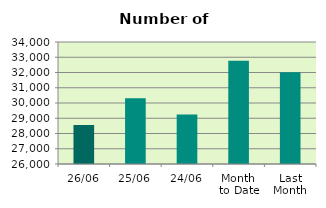
| Category | Series 0 |
|---|---|
| 26/06 | 28556 |
| 25/06 | 30314 |
| 24/06 | 29244 |
| Month 
to Date | 32770.667 |
| Last
Month | 32020.364 |